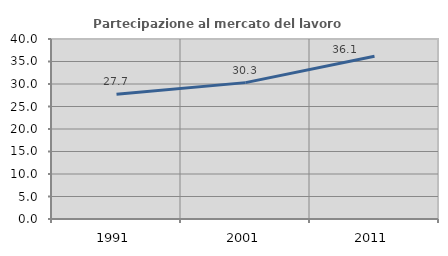
| Category | Partecipazione al mercato del lavoro  femminile |
|---|---|
| 1991.0 | 27.735 |
| 2001.0 | 30.306 |
| 2011.0 | 36.15 |